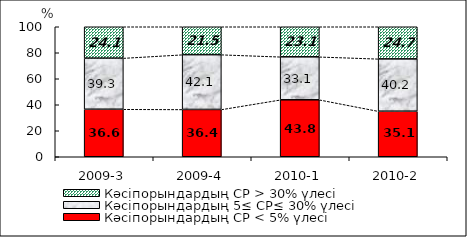
| Category | Кәсіпорындардың СР < 5% үлесі | Кәсіпорындардың 5≤ СР≤ 30% үлесі | Кәсіпорындардың СР > 30% үлесі |
|---|---|---|---|
| 2009-3 | 36.551 | 39.334 | 24.115 |
| 2009-4 | 36.397 | 42.132 | 21.471 |
| 2010-1 | 43.821 | 33.055 | 23.124 |
| 2010-2 | 35.055 | 40.24 | 24.705 |